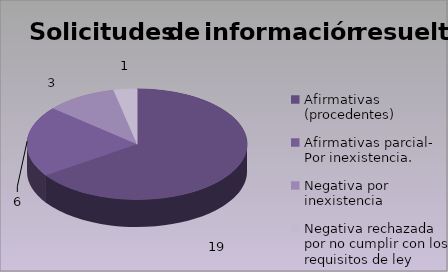
| Category | Series 0 |
|---|---|
| Afirmativas (procedentes) | 19 |
| Afirmativas parcial- Por inexistencia.                                                                                 | 6 |
| Negativa por inexistencia                                                                                                                                                                                                                                       | 3 |
| Negativa rechazada por no cumplir con los requisitos de ley                                                                                                                                                                                                     | 1 |